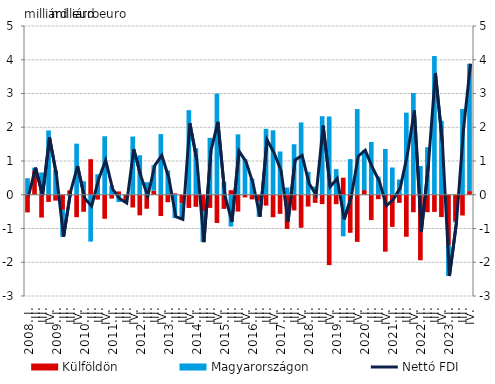
| Category | Külföldön | Magyarországon |
|---|---|---|
| 2008. I. | -0.523 | 0.489 |
| II. | 0.711 | 0.092 |
| III. | -0.676 | 0.659 |
| IV. | -0.212 | 1.905 |
| 2009. I. | -0.174 | 0.737 |
| II. | -0.448 | -0.796 |
| III. | 0.131 | -0.04 |
| IV. | -0.666 | 1.515 |
| 2010. I. | -0.505 | 0.399 |
| II. | 1.053 | -1.388 |
| III. | -0.144 | 0.607 |
| IV. | -0.712 | 1.734 |
| 2011. I. | -0.114 | 0.276 |
| II. | 0.098 | -0.214 |
| III. | -0.184 | -0.06 |
| IV. | -0.376 | 1.725 |
| 2012. I. | -0.609 | 1.169 |
| II. | -0.415 | 0.373 |
| III. | 0.117 | 0.757 |
| IV. | -0.631 | 1.797 |
| 2013. I. | -0.221 | 0.718 |
| II. | 0.041 | -0.692 |
| III. | -0.258 | -0.471 |
| IV. | -0.391 | 2.506 |
| 2014. I. | -0.358 | 1.381 |
| II. | -0.488 | -0.915 |
| III. | -0.39 | 1.686 |
| IV. | -0.836 | 2.998 |
| 2015. I. | -0.419 | 0.389 |
| II. | 0.135 | -0.941 |
| III. | -0.497 | 1.791 |
| IV. | -0.079 | 1.06 |
| 2016. I. | -0.139 | 0.479 |
| II. | -0.19 | -0.461 |
| III. | -0.323 | 1.953 |
| IV. | -0.666 | 1.91 |
| 2017. I. | -0.566 | 1.282 |
| II. | -1.012 | 0.215 |
| III. | -0.465 | 1.497 |
| IV. | -0.978 | 2.142 |
| 2018. I. | -0.35 | 0.679 |
| II. | -0.241 | 0.241 |
| III. | -0.278 | 2.327 |
| IV. | -2.085 | 2.318 |
| 2019. I. | -0.279 | 0.759 |
| II. | 0.506 | -1.232 |
| III. | -1.127 | 1.057 |
| IV. | -1.396 | 2.539 |
| 2020. I. | 0.138 | 1.182 |
| II. | -0.75 | 1.564 |
| III. | -0.131 | 0.537 |
| IV. | -1.687 | 1.357 |
| 2021. I. | -0.951 | 0.807 |
| II. | -0.24 | 0.452 |
| III. | -1.244 | 2.434 |
| IV. | -0.519 | 3.014 |
| 2022. I. | -1.94 | 0.851 |
| II. | -0.517 | 1.409 |
| III. | -0.507 | 4.113 |
| IV. | -0.659 | 2.192 |
| 2023. I. | -1.498 | -0.909 |
| II. | -0.78 | -0.043 |
| III. | -0.613 | 2.543 |
| IV. | 0.108 | 3.775 |